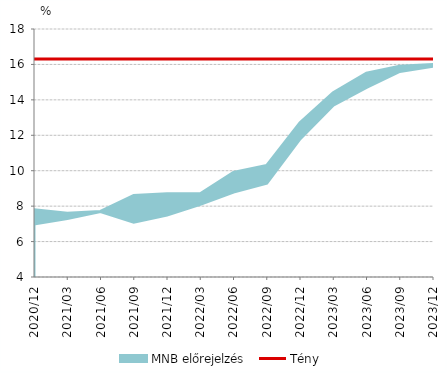
| Category | Tény |
|---|---|
| 2020-12-01 | 16.3 |
| 2021-03-01 | 16.3 |
| 2021-06-01 | 16.3 |
| 2021-09-01 | 16.3 |
| 2021-12-01 | 16.3 |
| 2022-03-01 | 16.3 |
| 2022-06-01 | 16.3 |
| 2022-09-01 | 16.3 |
| 2022-12-01 | 16.3 |
| 2023-03-01 | 16.3 |
| 2023-06-01 | 16.3 |
| 2023-09-01 | 16.3 |
| 2023-12-01 | 16.3 |